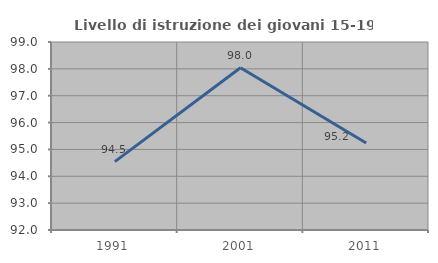
| Category | Livello di istruzione dei giovani 15-19 anni |
|---|---|
| 1991.0 | 94.545 |
| 2001.0 | 98.039 |
| 2011.0 | 95.238 |